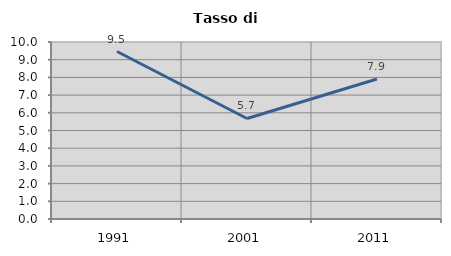
| Category | Tasso di disoccupazione   |
|---|---|
| 1991.0 | 9.463 |
| 2001.0 | 5.678 |
| 2011.0 | 7.911 |